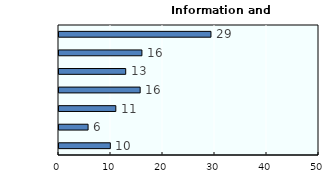
| Category | Information and communication |
|---|---|
| Chamber of commerce | 9.873 |
| Female group | 5.592 |
| Group similar jobs | 10.928 |
| Industry group | 15.609 |
| Other | 12.83 |
| SME group | 15.946 |
| None | 29.222 |